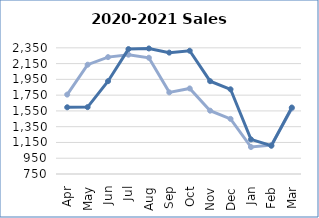
| Category | Sold 19 | Sold 20 |
|---|---|---|
| Apr | 1757 | 1596 |
| May | 2136 | 1598 |
| Jun | 2232 | 1927 |
| Jul | 2263 | 2334 |
| Aug | 2224 | 2342 |
| Sep | 1785 | 2289 |
| Oct | 1835 | 2313 |
| Nov | 1553 | 1927 |
| Dec | 1449 | 1824 |
| Jan | 1092 | 1189 |
| Feb | 1116 | 1108 |
| Mar | 1581 | 1593 |